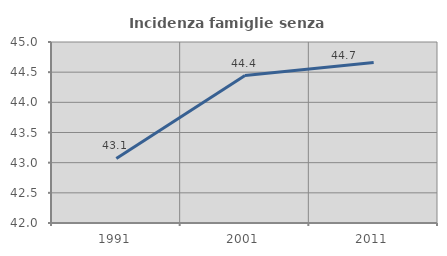
| Category | Incidenza famiglie senza nuclei |
|---|---|
| 1991.0 | 43.069 |
| 2001.0 | 44.444 |
| 2011.0 | 44.66 |